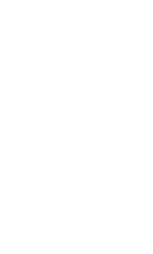
| Category | % VBA |
|---|---|
| 0 | 0 |